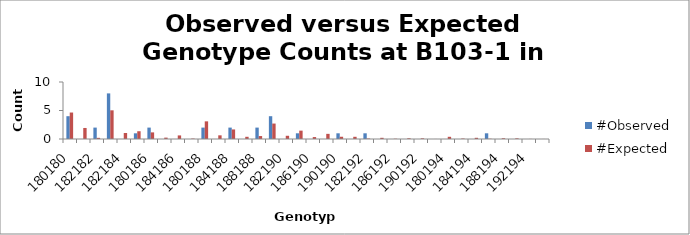
| Category | #Observed | #Expected |
|---|---|---|
| 180180.0 | 4 | 4.645 |
| 180182.0 | 0 | 1.935 |
| 182182.0 | 2 | 0.202 |
| 180184.0 | 8 | 5.032 |
| 182184.0 | 0 | 1.048 |
| 184184.0 | 1 | 1.363 |
| 180186.0 | 2 | 1.161 |
| 182186.0 | 0 | 0.242 |
| 184186.0 | 0 | 0.629 |
| 186186.0 | 0 | 0.073 |
| 180188.0 | 2 | 3.097 |
| 182188.0 | 0 | 0.645 |
| 184188.0 | 2 | 1.677 |
| 186188.0 | 0 | 0.387 |
| 188188.0 | 2 | 0.516 |
| 180190.0 | 4 | 2.71 |
| 182190.0 | 0 | 0.565 |
| 184190.0 | 1 | 1.468 |
| 186190.0 | 0 | 0.339 |
| 188190.0 | 0 | 0.903 |
| 190190.0 | 1 | 0.395 |
| 180192.0 | 0 | 0.387 |
| 182192.0 | 1 | 0.081 |
| 184192.0 | 0 | 0.21 |
| 186192.0 | 0 | 0.048 |
| 188192.0 | 0 | 0.129 |
| 190192.0 | 0 | 0.113 |
| 192192.0 | 0 | 0.008 |
| 180194.0 | 0 | 0.387 |
| 182194.0 | 0 | 0.081 |
| 184194.0 | 0 | 0.21 |
| 186194.0 | 1 | 0.048 |
| 188194.0 | 0 | 0.129 |
| 190194.0 | 0 | 0.113 |
| 192194.0 | 0 | 0.016 |
| 194194.0 | 0 | 0.008 |